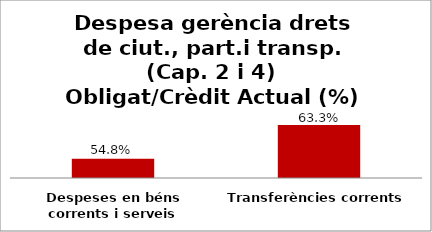
| Category | Series 0 |
|---|---|
| Despeses en béns corrents i serveis | 0.548 |
| Transferències corrents | 0.633 |